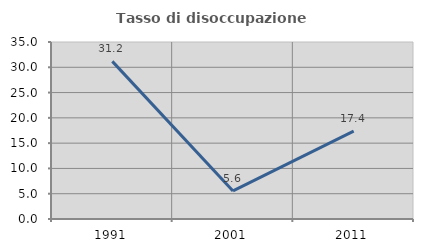
| Category | Tasso di disoccupazione giovanile  |
|---|---|
| 1991.0 | 31.169 |
| 2001.0 | 5.556 |
| 2011.0 | 17.391 |